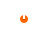
| Category | Azores |
|---|---|
| 0 | 0 |
| 1 | 0 |
| 2 | 499 |